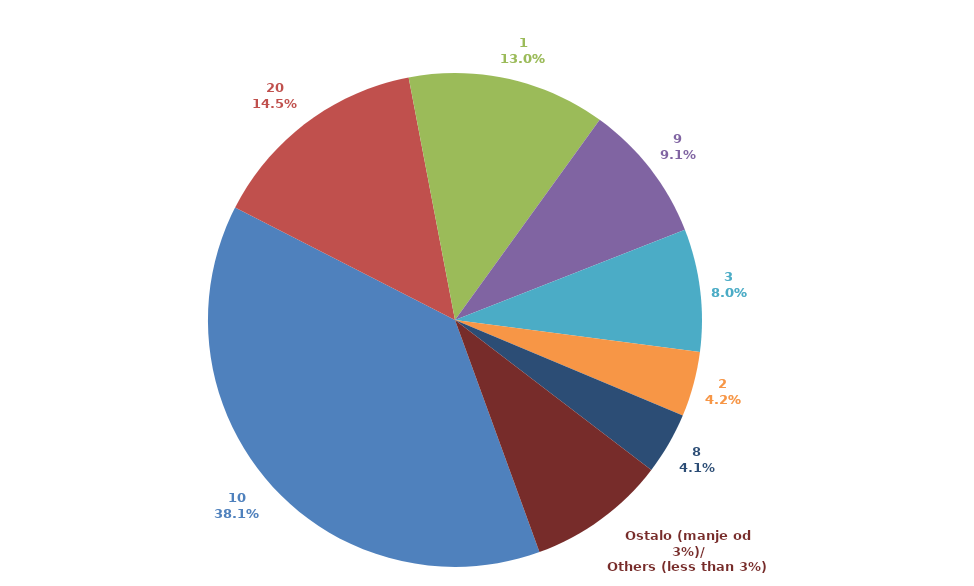
| Category | Series 0 |
|---|---|
| 10 | 0.381 |
| 20 | 0.145 |
| 1 | 0.13 |
| 9 | 0.091 |
| 3 | 0.08 |
| 2 | 0.043 |
| 8 | 0.041 |
| Ostalo (manje od 3%)/
Others (less than 3%) | 0.091 |